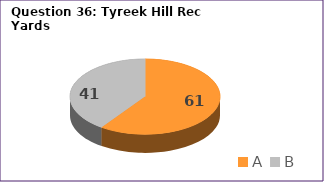
| Category | Series 0 |
|---|---|
| A | 61 |
| B | 41 |